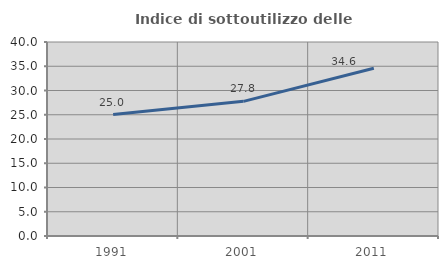
| Category | Indice di sottoutilizzo delle abitazioni  |
|---|---|
| 1991.0 | 25.028 |
| 2001.0 | 27.762 |
| 2011.0 | 34.579 |